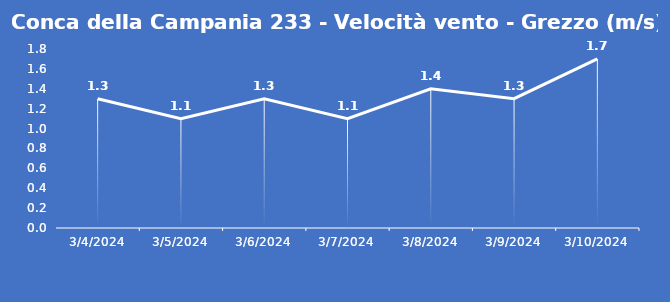
| Category | Conca della Campania 233 - Velocità vento - Grezzo (m/s) |
|---|---|
| 3/4/24 | 1.3 |
| 3/5/24 | 1.1 |
| 3/6/24 | 1.3 |
| 3/7/24 | 1.1 |
| 3/8/24 | 1.4 |
| 3/9/24 | 1.3 |
| 3/10/24 | 1.7 |